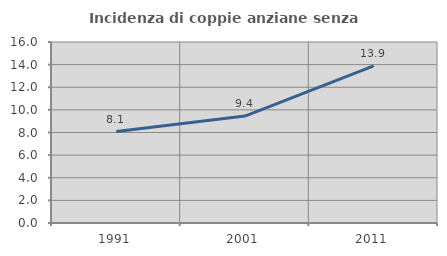
| Category | Incidenza di coppie anziane senza figli  |
|---|---|
| 1991.0 | 8.081 |
| 2001.0 | 9.449 |
| 2011.0 | 13.889 |